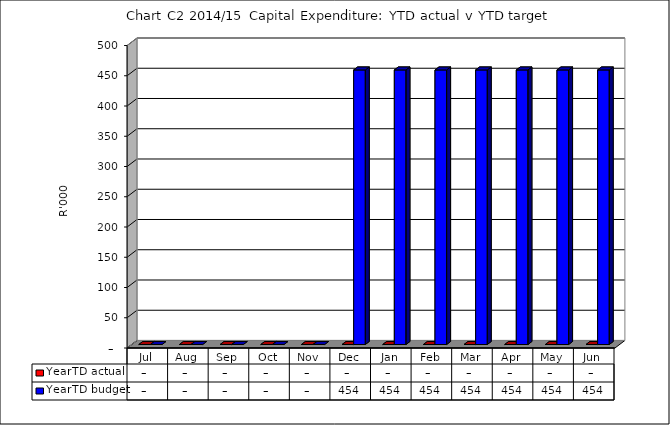
| Category | YearTD actual | YearTD budget |
|---|---|---|
| Jul | 0 | 0 |
| Aug | 0 | 0 |
| Sep | 0 | 0 |
| Oct | 0 | 0 |
| Nov | 0 | 0 |
| Dec | 0 | 453840 |
| Jan | 0 | 453840 |
| Feb | 0 | 453840 |
| Mar | 0 | 453840 |
| Apr | 0 | 453840 |
| May | 0 | 453840 |
| Jun | 0 | 453840 |